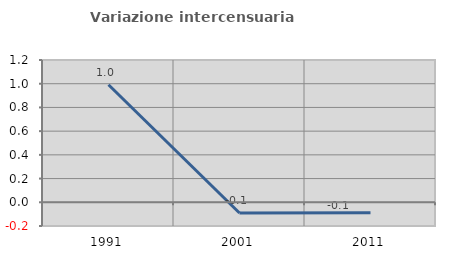
| Category | Variazione intercensuaria annua |
|---|---|
| 1991.0 | 0.992 |
| 2001.0 | -0.09 |
| 2011.0 | -0.089 |